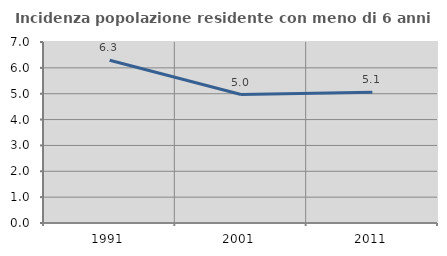
| Category | Incidenza popolazione residente con meno di 6 anni |
|---|---|
| 1991.0 | 6.296 |
| 2001.0 | 4.967 |
| 2011.0 | 5.056 |